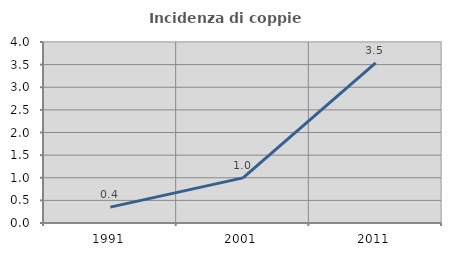
| Category | Incidenza di coppie miste |
|---|---|
| 1991.0 | 0.351 |
| 2001.0 | 0.998 |
| 2011.0 | 3.539 |